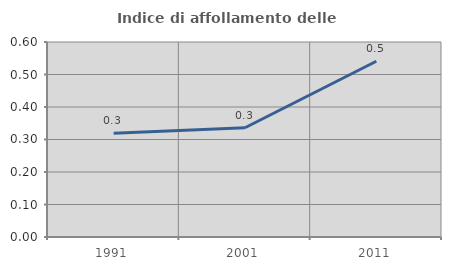
| Category | Indice di affollamento delle abitazioni  |
|---|---|
| 1991.0 | 0.319 |
| 2001.0 | 0.336 |
| 2011.0 | 0.541 |